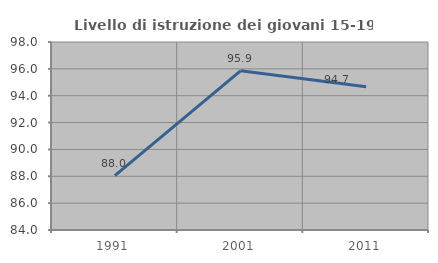
| Category | Livello di istruzione dei giovani 15-19 anni |
|---|---|
| 1991.0 | 88.043 |
| 2001.0 | 95.851 |
| 2011.0 | 94.675 |